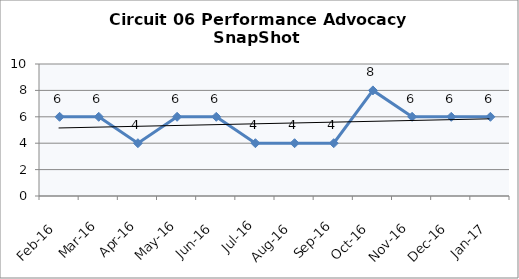
| Category | Circuit 06 |
|---|---|
| Feb-16 | 6 |
| Mar-16 | 6 |
| Apr-16 | 4 |
| May-16 | 6 |
| Jun-16 | 6 |
| Jul-16 | 4 |
| Aug-16 | 4 |
| Sep-16 | 4 |
| Oct-16 | 8 |
| Nov-16 | 6 |
| Dec-16 | 6 |
| Jan-17 | 6 |